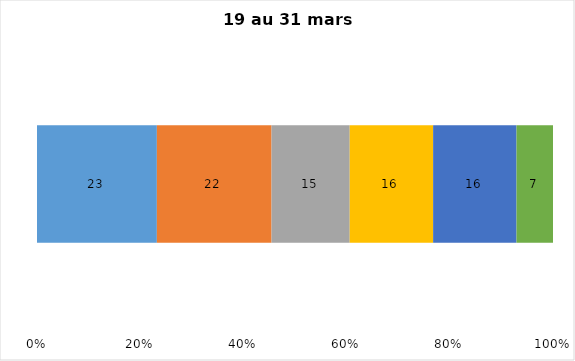
| Category | Plusieurs fois par jour | Une fois par jour | Quelques fois par semaine   | Une fois par semaine ou moins   |  Jamais   |  Je n’utilise pas les médias sociaux |
|---|---|---|---|---|---|---|
| 0 | 23 | 22 | 15 | 16 | 16 | 7 |